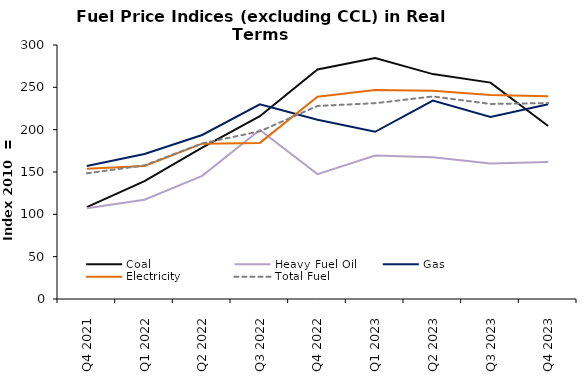
| Category | Coal | Heavy Fuel Oil | Gas | Electricity | Total Fuel |
|---|---|---|---|---|---|
| Q4 2021 | 108.541 | 107.193 | 157.042 | 153.926 | 148.432 |
| Q1 2022 | 139.146 | 117.168 | 171.189 | 157.139 | 157.851 |
| Q2 2022 | 178.664 | 145.467 | 193.693 | 183.47 | 183.788 |
| Q3 2022 | 215.915 | 199.709 | 229.852 | 184.391 | 198.045 |
| Q4 2022 | 271.138 | 147.498 | 211.773 | 238.955 | 228.023 |
| Q1 2023 | 284.744 | 169.41 | 197.496 | 246.901 | 231.258 |
| Q2 2023 | 265.616 | 167.422 | 234.353 | 245.849 | 239.22 |
| Q3 2023 | 255.583 | 159.973 | 215.105 | 241.039 | 230.372 |
| Q4 2023 | 204.363 | 161.729 | 229.988 | 239.474 | 231.416 |